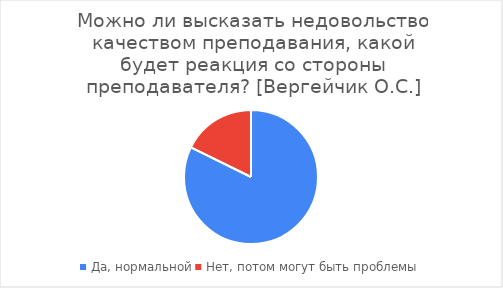
| Category | Series 0 |
|---|---|
| Да, нормальной | 65 |
| Нет, потом могут быть проблемы | 14 |